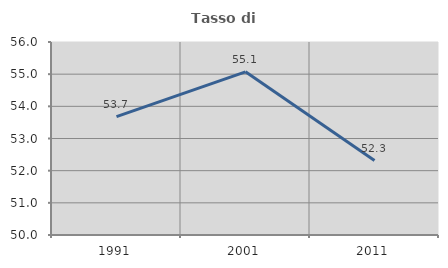
| Category | Tasso di occupazione   |
|---|---|
| 1991.0 | 53.679 |
| 2001.0 | 55.074 |
| 2011.0 | 52.314 |